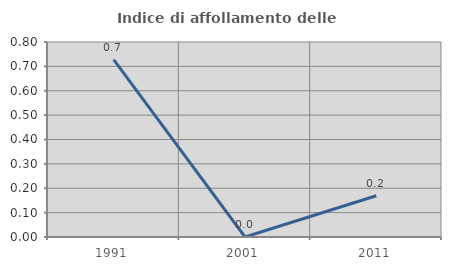
| Category | Indice di affollamento delle abitazioni  |
|---|---|
| 1991.0 | 0.727 |
| 2001.0 | 0 |
| 2011.0 | 0.169 |